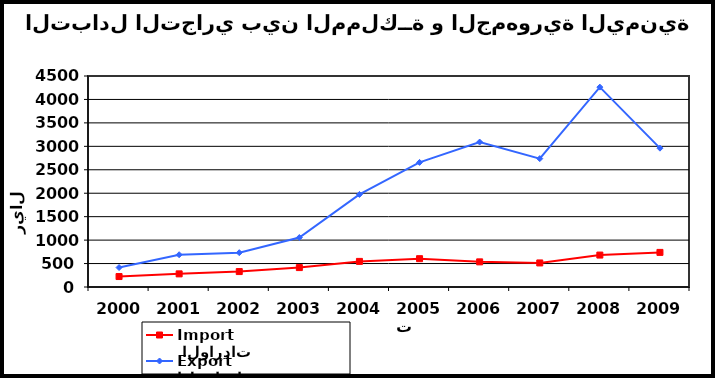
| Category |  الواردات           Import | الصادرات          Export |
|---|---|---|
| 2000.0 | 223 | 415 |
| 2001.0 | 280 | 688 |
| 2002.0 | 329 | 732 |
| 2003.0 | 414 | 1055 |
| 2004.0 | 546 | 1974 |
| 2005.0 | 604 | 2657 |
| 2006.0 | 536 | 3091 |
| 2007.0 | 513 | 2738 |
| 2008.0 | 681 | 4263 |
| 2009.0 | 738 | 2961 |